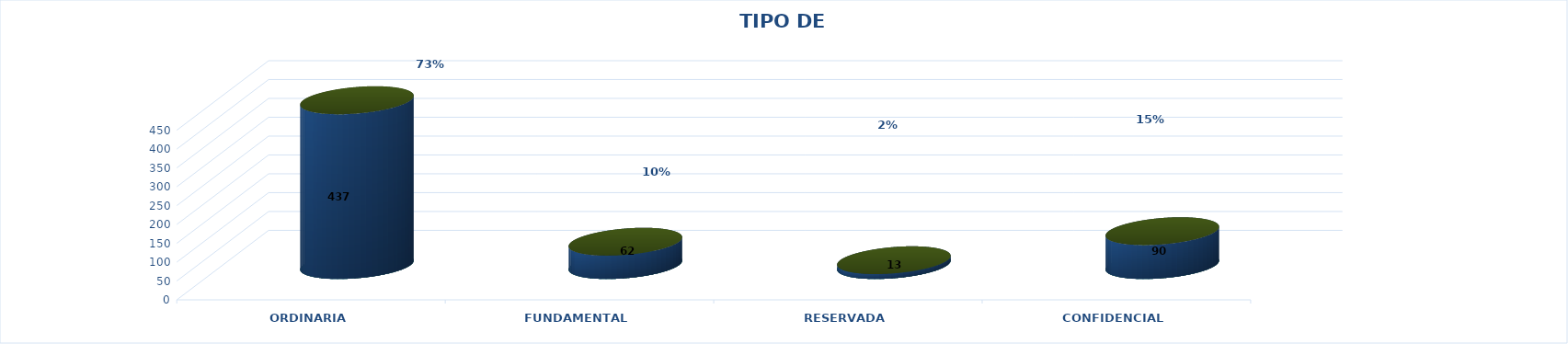
| Category | Series 0 | Series 2 | Series 1 | Series 3 | Series 4 |
|---|---|---|---|---|---|
| ORDINARIA |  |  |  | 437 | 0.726 |
| FUNDAMENTAL |  |  |  | 62 | 0.103 |
| RESERVADA |  |  |  | 13 | 0.022 |
| CONFIDENCIAL |  |  |  | 90 | 0.15 |